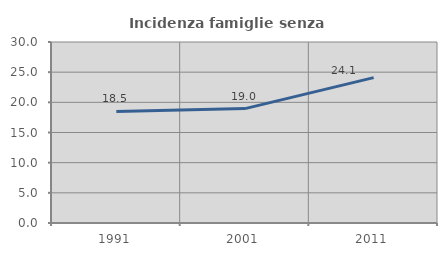
| Category | Incidenza famiglie senza nuclei |
|---|---|
| 1991.0 | 18.485 |
| 2001.0 | 18.96 |
| 2011.0 | 24.097 |